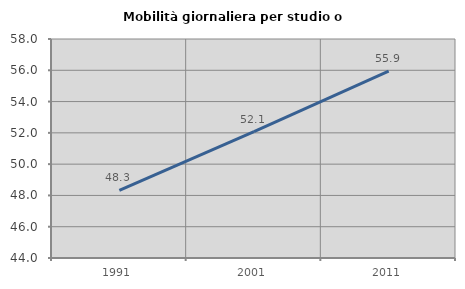
| Category | Mobilità giornaliera per studio o lavoro |
|---|---|
| 1991.0 | 48.321 |
| 2001.0 | 52.081 |
| 2011.0 | 55.944 |